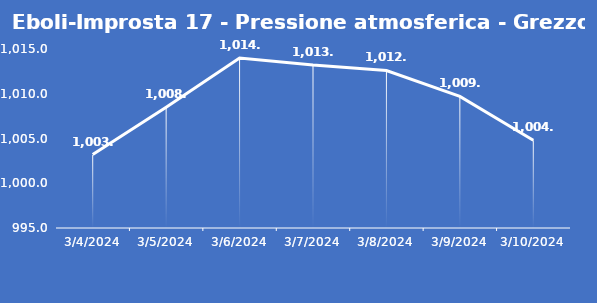
| Category | Eboli-Improsta 17 - Pressione atmosferica - Grezzo (hPa) |
|---|---|
| 3/4/24 | 1003.2 |
| 3/5/24 | 1008.5 |
| 3/6/24 | 1014 |
| 3/7/24 | 1013.2 |
| 3/8/24 | 1012.6 |
| 3/9/24 | 1009.7 |
| 3/10/24 | 1004.8 |